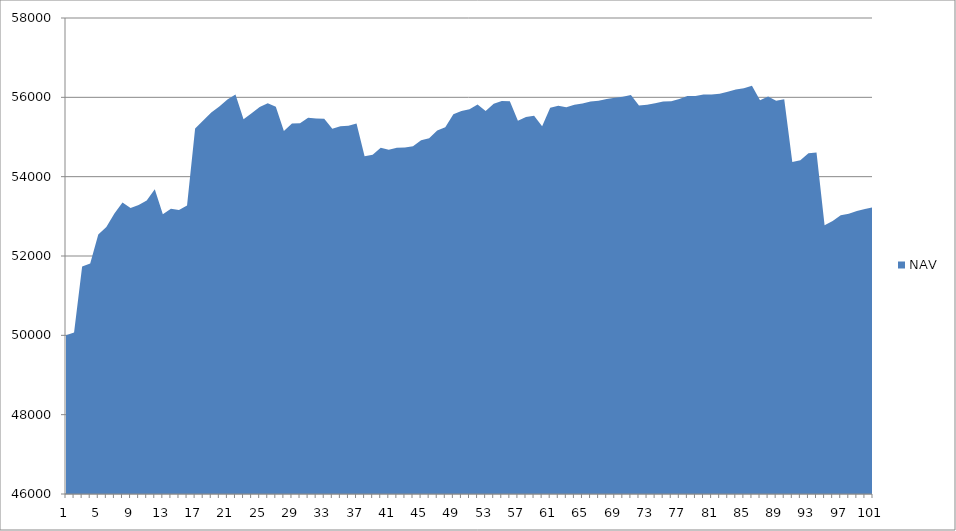
| Category | NAV |
|---|---|
| 0 | 50000 |
| 1 | 50069.444 |
| 2 | 51736.444 |
| 3 | 51809.343 |
| 4 | 52539.343 |
| 5 | 52733.57 |
| 6 | 53070.527 |
| 7 | 53346.212 |
| 8 | 53210.13 |
| 9 | 53285.788 |
| 10 | 53396.685 |
| 11 | 53684.185 |
| 12 | 53050.597 |
| 13 | 53191.058 |
| 14 | 53162.649 |
| 15 | 53270.317 |
| 16 | 55214.762 |
| 17 | 55418.583 |
| 18 | 55617.273 |
| 19 | 55770.477 |
| 20 | 55945.477 |
| 21 | 56069.601 |
| 22 | 55444.601 |
| 23 | 55597.925 |
| 24 | 55757.558 |
| 25 | 55851.308 |
| 26 | 55764.06 |
| 27 | 55148.361 |
| 28 | 55340.028 |
| 29 | 55349.317 |
| 30 | 55485.393 |
| 31 | 55468.704 |
| 32 | 55461.038 |
| 33 | 55205.356 |
| 34 | 55270.356 |
| 35 | 55282.57 |
| 36 | 55341.011 |
| 37 | 54517.482 |
| 38 | 54554.291 |
| 39 | 54731.016 |
| 40 | 54679.093 |
| 41 | 54730.595 |
| 42 | 54736.73 |
| 43 | 54765.085 |
| 44 | 54915.643 |
| 45 | 54969.86 |
| 46 | 55164.665 |
| 47 | 55247.746 |
| 48 | 55575.668 |
| 49 | 55657.905 |
| 50 | 55701.032 |
| 51 | 55819.28 |
| 52 | 55652.834 |
| 53 | 55838.604 |
| 54 | 55905.769 |
| 55 | 55898.888 |
| 56 | 55410.9 |
| 57 | 55504.564 |
| 58 | 55537.603 |
| 59 | 55268.471 |
| 60 | 55737.858 |
| 61 | 55785.708 |
| 62 | 55749.829 |
| 63 | 55815.591 |
| 64 | 55842.34 |
| 65 | 55894.021 |
| 66 | 55916.828 |
| 67 | 55955.697 |
| 68 | 55991.896 |
| 69 | 56012.065 |
| 70 | 56060.293 |
| 71 | 55791.443 |
| 72 | 55810.674 |
| 73 | 55852.843 |
| 74 | 55892.018 |
| 75 | 55900.069 |
| 76 | 55955.739 |
| 77 | 56030.918 |
| 78 | 56036.168 |
| 79 | 56069.975 |
| 80 | 56071.656 |
| 81 | 56090.406 |
| 82 | 56141.798 |
| 83 | 56199.159 |
| 84 | 56228.237 |
| 85 | 56292.573 |
| 86 | 55924.369 |
| 87 | 56019.106 |
| 88 | 55916.165 |
| 89 | 55950.09 |
| 90 | 54367.13 |
| 91 | 54411.811 |
| 92 | 54588.933 |
| 93 | 54611.197 |
| 94 | 52777.117 |
| 95 | 52883.107 |
| 96 | 53025.651 |
| 97 | 53064.908 |
| 98 | 53135.652 |
| 99 | 53186.005 |
| 100 | 53229.789 |